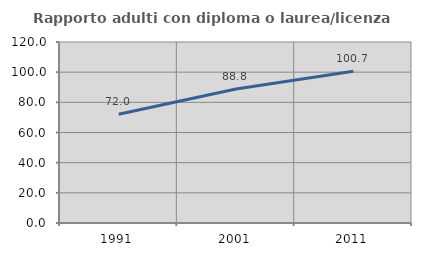
| Category | Rapporto adulti con diploma o laurea/licenza media  |
|---|---|
| 1991.0 | 72.044 |
| 2001.0 | 88.808 |
| 2011.0 | 100.653 |